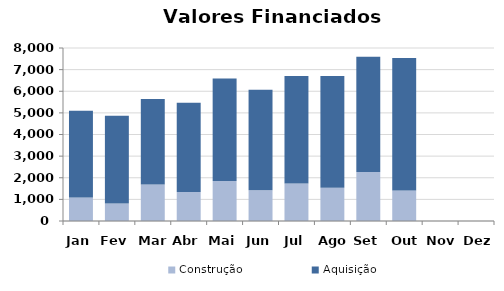
| Category | Construção | Aquisição  |
|---|---|---|
| Jan | 1091.225 | 4005.43 |
| Fev | 806.874 | 4059.044 |
| Mar | 1684.101 | 3954.739 |
| Abr | 1343.897 | 4119.704 |
| Mai | 1850.725 | 4740.725 |
| Jun | 1419.474 | 4644.895 |
| Jul | 1735.812 | 4964.527 |
| Ago | 1534.929 | 5174.54 |
| Set | 2264.813 | 5328.862 |
| Out | 1414.69 | 6118.877 |
| Nov | 0 | 0 |
| Dez | 0 | 0 |